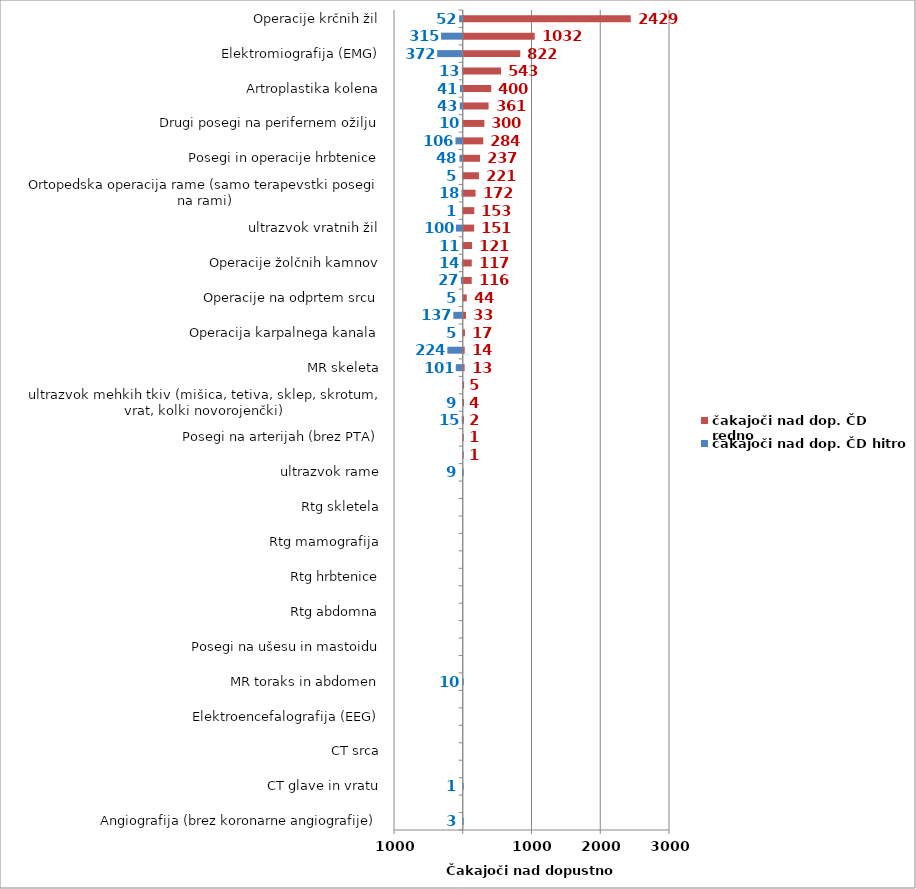
| Category | čakajoči nad dop. ČD hitro | čakajoči nad dop. ČD redno |
|---|---|---|
| Angiografija (brez koronarne angiografije) | -3 | 0 |
| Artroplastika gležnja | 0 | 0 |
| CT glave in vratu | -1 | 0 |
| CT skeleta | 0 | 0 |
| CT srca | 0 | 0 |
| CT toraks in abdomen | 0 | 0 |
| Elektroencefalografija (EEG) | 0 | 0 |
| MR srca | 0 | 0 |
| MR toraks in abdomen | -10 | 0 |
| Operacije kile-otroci | 0 | 0 |
| Posegi na ušesu in mastoidu | 0 | 0 |
| PTA (perkutana transluminalna angioplastika) | 0 | 0 |
| Rtg abdomna | 0 | 0 |
| Rtg glave | 0 | 0 |
| Rtg hrbtenice | 0 | 0 |
| Rtg ledvic in sečnega mehurja | 0 | 0 |
| Rtg mamografija | 0 | 0 |
| Rtg PC | 0 | 0 |
| Rtg skletela | 0 | 0 |
| Sklerozacija krčnih žil | 0 | 0 |
| ultrazvok rame | -9 | 0 |
| CT angiografije | 0 | 1 |
| Posegi na arterijah (brez PTA) | 0 | 1 |
| MR angiografije | -15 | 2 |
| ultrazvok mehkih tkiv (mišica, tetiva, sklep, skrotum, vrat, kolki novorojenčki) | -9 | 4 |
| Operacija ščitnice (tudi obščitnice) | 0 | 5 |
| MR skeleta | -101 | 13 |
| MR glave in vratu | -224 | 14 |
| Operacija karpalnega kanala | -5 | 17 |
| Koronarna angiografija in PTCA | -137 | 33 |
| Operacije na odprtem srcu | -5 | 44 |
| Terapevtske artroskopije (kolenske križne vezi, kolena) | -27 | 116 |
| Operacije žolčnih kamnov | -14 | 117 |
| ultrazvok dojke | -11 | 121 |
| ultrazvok vratnih žil | -100 | 151 |
| Posegi in operacije nosu in obnosnih votlin | -1 | 153 |
| Ortopedska operacija rame (samo terapevstki posegi na rami) | -18 | 172 |
| Operacija sive mrene (katarakta) | -5 | 221 |
| Posegi in operacije hrbtenice | -48 | 237 |
| Artroplastika kolka (protetika, endoproteza) | -106 | 284 |
| Drugi posegi na perifernem ožilju | -10 | 300 |
| Operacije kile-odrasli | -43 | 361 |
| Artroplastika kolena | -41 | 400 |
| Posegi in operacije v ustih, grlu in žrelu | -13 | 543 |
| Elektromiografija (EMG) | -372 | 822 |
| ultrazvok srca | -315 | 1032 |
| Operacije krčnih žil | -52 | 2429 |